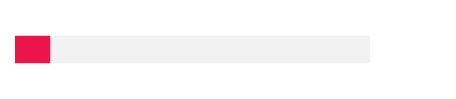
| Category | Series 0 | Series 1 |
|---|---|---|
| 0 | 0.01 | 0.09 |